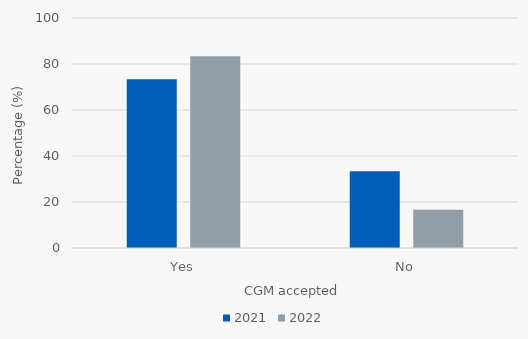
| Category | 2021 | 2022 |
|---|---|---|
| Yes | 73.333 | 83.333 |
| No | 33.333 | 16.667 |